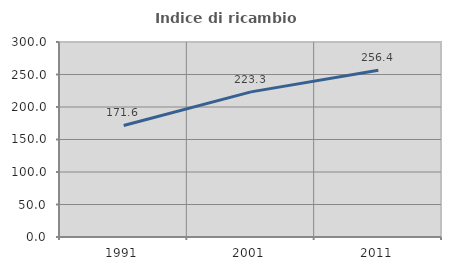
| Category | Indice di ricambio occupazionale  |
|---|---|
| 1991.0 | 171.563 |
| 2001.0 | 223.284 |
| 2011.0 | 256.43 |